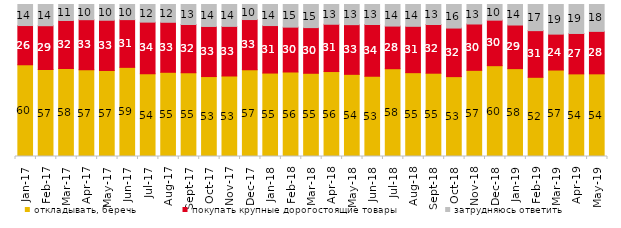
| Category | откладывать, беречь | покупать крупные дорогостоящие товары | затрудняюсь ответить |
|---|---|---|---|
| 2017-01-01 | 60.35 | 25.8 | 13.85 |
| 2017-02-01 | 56.8 | 28.6 | 13.85 |
| 2017-03-01 | 57.9 | 31.6 | 10.5 |
| 2017-04-01 | 57.1 | 32.85 | 10 |
| 2017-05-01 | 56.6 | 33.05 | 10.35 |
| 2017-06-01 | 58.65 | 31.4 | 9.95 |
| 2017-07-01 | 54.4 | 34 | 11.6 |
| 2017-08-01 | 55.4 | 32.9 | 11.7 |
| 2017-09-01 | 55.1 | 31.75 | 13.15 |
| 2017-10-01 | 52.6 | 32.95 | 14.45 |
| 2017-11-01 | 52.9 | 32.7 | 14.4 |
| 2017-12-01 | 57.1 | 33 | 9.9 |
| 2018-01-01 | 54.9 | 31.25 | 13.85 |
| 2018-02-01 | 55.6 | 29.5 | 14.9 |
| 2018-03-01 | 54.75 | 30.05 | 15.2 |
| 2018-04-01 | 55.9 | 31.1 | 13 |
| 2018-05-01 | 54.05 | 32.7 | 13.25 |
| 2018-06-01 | 52.85 | 34 | 13.15 |
| 2018-07-01 | 57.75 | 28.05 | 14.2 |
| 2018-08-01 | 55.15 | 30.5 | 14.35 |
| 2018-09-01 | 54.8 | 32.05 | 13.15 |
| 2018-10-01 | 52.55 | 31.95 | 15.5 |
| 2018-11-01 | 56.687 | 30.489 | 12.824 |
| 2018-12-01 | 59.75 | 29.95 | 10.3 |
| 2019-01-01 | 57.8 | 28.7 | 13.5 |
| 2019-02-01 | 52.1 | 30.7 | 17.2 |
| 2019-03-01 | 56.887 | 23.62 | 19.493 |
| 2019-04-01 | 54.356 | 26.584 | 19.059 |
| 2019-05-01 | 54.383 | 27.935 | 17.682 |